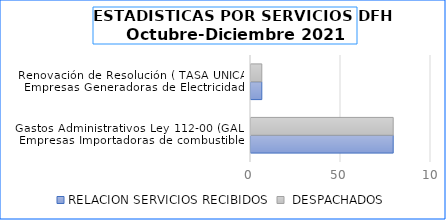
| Category | RELACION SERVICIOS RECIBIDOS | RELACION SERVICIOS DESPACHADOS |
|---|---|---|
| Gastos Administrativos Ley 112-00 (GAL)   Empresas Importadoras de combustibles | 79 | 79 |
|  Renovación de Resolución ( TASA UNICA)  Empresas Generadoras de Electricidad | 6 | 6 |